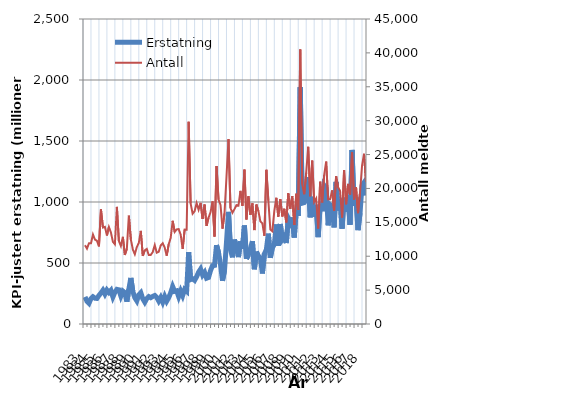
| Category | Erstatning |
|---|---|
| 1983.0 | 221.949 |
| nan | 185.917 |
| nan | 170.02 |
| nan | 208.268 |
| 1984.0 | 223.332 |
| nan | 211.256 |
| nan | 209.456 |
| nan | 234.278 |
| 1985.0 | 253.168 |
| nan | 276.72 |
| nan | 245.206 |
| nan | 278.097 |
| 1986.0 | 257.839 |
| nan | 275.898 |
| nan | 222.061 |
| nan | 259.862 |
| 1987.0 | 283.894 |
| nan | 280.151 |
| nan | 229.26 |
| nan | 269.731 |
| 1988.0 | 256.73 |
| nan | 183.009 |
| nan | 285.041 |
| nan | 377.599 |
| 1989.0 | 266.765 |
| nan | 215.61 |
| nan | 189.719 |
| nan | 239.351 |
| 1990.0 | 256.282 |
| nan | 206.18 |
| nan | 178.813 |
| nan | 208.132 |
| 1991.0 | 224.594 |
| nan | 215.946 |
| nan | 226.002 |
| nan | 233.658 |
| 1992.0 | 218.279 |
| nan | 188.082 |
| nan | 217.323 |
| nan | 179.335 |
| 1993.0 | 225.016 |
| nan | 187.263 |
| nan | 216.35 |
| nan | 255.948 |
| 1994.0 | 306.554 |
| nan | 267.998 |
| nan | 272.283 |
| nan | 224.429 |
| 1995.0 | 270.389 |
| nan | 232.615 |
| nan | 282.652 |
| nan | 268.364 |
| 1996.0 | 588.52 |
| nan | 364.421 |
| nan | 370.932 |
| nan | 357.735 |
| 1997.0 | 387.279 |
| nan | 424.973 |
| nan | 450.052 |
| nan | 401.55 |
| 1998.0 | 423.625 |
| nan | 375.292 |
| nan | 381.423 |
| nan | 438.403 |
| 1999.0 | 478.172 |
| nan | 480.494 |
| nan | 646.566 |
| nan | 585.551 |
| 2000.0 | 488.096 |
| nan | 354.465 |
| nan | 439.436 |
| nan | 670.004 |
| 2001.0 | 919.504 |
| nan | 608.715 |
| nan | 546.707 |
| nan | 691.697 |
| 2002.0 | 629.967 |
| nan | 548.133 |
| nan | 677.398 |
| nan | 617.261 |
| 2003.0 | 807.292 |
| nan | 533.752 |
| nan | 567.845 |
| nan | 618.583 |
| 2004.0 | 678.619 |
| nan | 448.657 |
| nan | 593.143 |
| nan | 554.406 |
| 2005.0 | 542.628 |
| nan | 414.1 |
| nan | 574.883 |
| nan | 609.232 |
| 2006.0 | 740.532 |
| nan | 543.078 |
| nan | 624.878 |
| nan | 651.921 |
| 2007.0 | 816.008 |
| nan | 641.555 |
| nan | 819.694 |
| nan | 693.036 |
| 2008.0 | 716.689 |
| nan | 663.474 |
| nan | 866.535 |
| nan | 832.218 |
| 2009.0 | 873.32 |
| nan | 708.997 |
| nan | 936.566 |
| nan | 885.25 |
| 2010.0 | 1941.881 |
| nan | 990.456 |
| nan | 995.22 |
| nan | 1018.153 |
| 2011.0 | 1203.27 |
| nan | 874.99 |
| nan | 1043.291 |
| nan | 879.248 |
| 2012.0 | 974.087 |
| nan | 712.146 |
| nan | 981.851 |
| nan | 924.505 |
| 2013.0 | 1135.389 |
| nan | 1111.761 |
| nan | 808.968 |
| nan | 977.139 |
| 2014.0 | 963.722 |
| nan | 791.406 |
| nan | 1164.2 |
| nan | 930.848 |
| 2015.0 | 1021.261 |
| nan | 782.106 |
| nan | 1035.286 |
| nan | 919.216 |
| 2016.0 | 1056.711 |
| nan | 813.389 |
| nan | 1426.54 |
| nan | 967.908 |
| 2017.0 | 1037.584 |
| nan | 769.551 |
| nan | 908.847 |
| nan | 1134.849 |
| 2018.0 | 1158.517 |
| nan | 1053.942 |